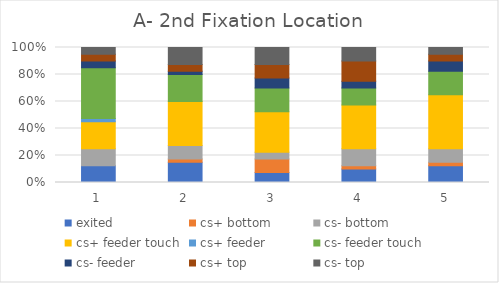
| Category | exited | cs+ bottom | cs- bottom | cs+ feeder touch | cs+ feeder | cs- feeder touch | cs- feeder | cs+ top | cs- top |
|---|---|---|---|---|---|---|---|---|---|
| 0 | 5 | 0 | 5 | 8 | 1 | 15 | 2 | 2 | 2 |
| 1 | 6 | 1 | 4 | 13 | 0 | 8 | 1 | 2 | 5 |
| 2 | 3 | 4 | 2 | 12 | 0 | 7 | 3 | 4 | 5 |
| 3 | 4 | 1 | 5 | 13 | 0 | 5 | 2 | 6 | 4 |
| 4 | 5 | 1 | 4 | 16 | 0 | 7 | 3 | 2 | 2 |